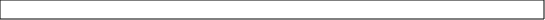
| Category | 'Tab 5'!#REF! |
|---|---|
| 0 | 1 |